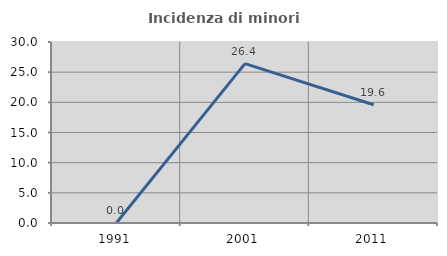
| Category | Incidenza di minori stranieri |
|---|---|
| 1991.0 | 0 |
| 2001.0 | 26.415 |
| 2011.0 | 19.608 |